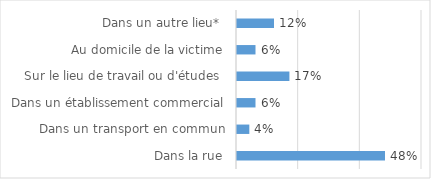
| Category | Series 0 |
|---|---|
| Dans la rue | 0.48 |
| Dans un transport en commun | 0.04 |
| Dans un établissement commercial | 0.06 |
| Sur le lieu de travail ou d'études  | 0.17 |
| Au domicile de la victime | 0.06 |
| Dans un autre lieu*  | 0.12 |